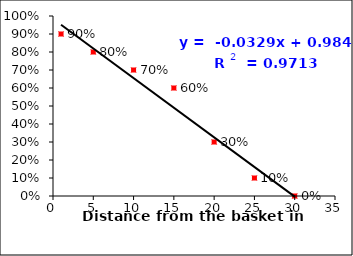
| Category | Series 0 |
|---|---|
| 1.0 | 0.9 |
| 5.0 | 0.8 |
| 10.0 | 0.7 |
| 15.0 | 0.6 |
| 20.0 | 0.3 |
| 25.0 | 0.1 |
| 30.0 | 0 |